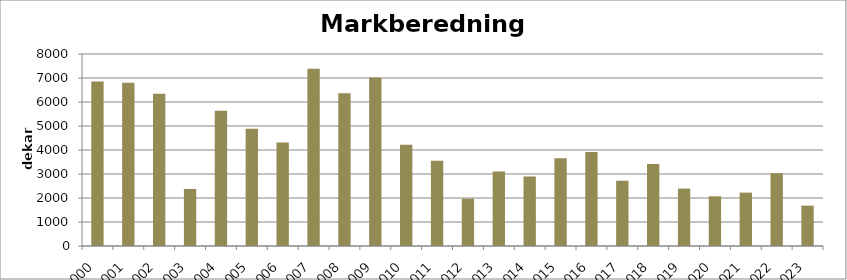
| Category | Totalt |
|---|---|
| 2000 | 6854 |
| 2001 | 6799 |
| 2002 | 6345 |
| 2003 | 2378 |
| 2004 | 5637 |
| 2005 | 4888 |
| 2006 | 4313 |
| 2007 | 7386 |
| 2008 | 6365 |
| 2009 | 7018 |
| 2010 | 4223 |
| 2011 | 3551 |
| 2012 | 1972 |
| 2013 | 3101 |
| 2014 | 2894 |
| 2015 | 3660 |
| 2016 | 3916 |
| 2017 | 2714 |
| 2018 | 3416 |
| 2019 | 2391 |
| 2020 | 2071 |
| 2021 | 2224 |
| 2022 | 3028 |
| 2023 | 1681 |